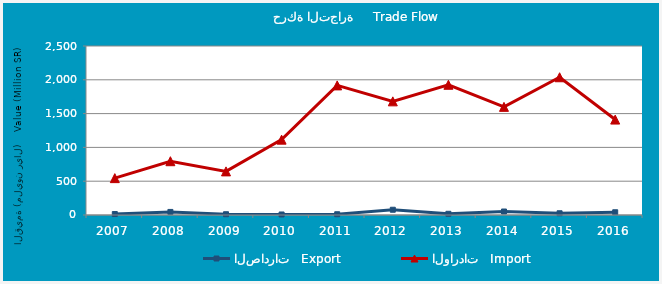
| Category | الصادرات   Export | الواردات   Import |
|---|---|---|
| 2007.0 | 14.113 | 545.302 |
| 2008.0 | 45.356 | 795.704 |
| 2009.0 | 11.406 | 645.138 |
| 2010.0 | 7.737 | 1114.765 |
| 2011.0 | 11.279 | 1917.271 |
| 2012.0 | 77.709 | 1681.257 |
| 2013.0 | 17.9 | 1926.129 |
| 2014.0 | 51.649 | 1599.485 |
| 2015.0 | 25.777 | 2037.594 |
| 2016.0 | 40.599 | 1411.758 |